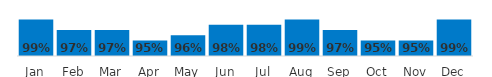
| Category | On time Delivery |
|---|---|
| Jan | 0.99 |
| Feb | 0.97 |
| Mar | 0.97 |
| Apr | 0.95 |
| May | 0.96 |
| Jun | 0.98 |
| Jul | 0.98 |
| Aug | 0.99 |
| Sep | 0.97 |
| Oct | 0.95 |
| Nov | 0.95 |
| Dec | 0.99 |